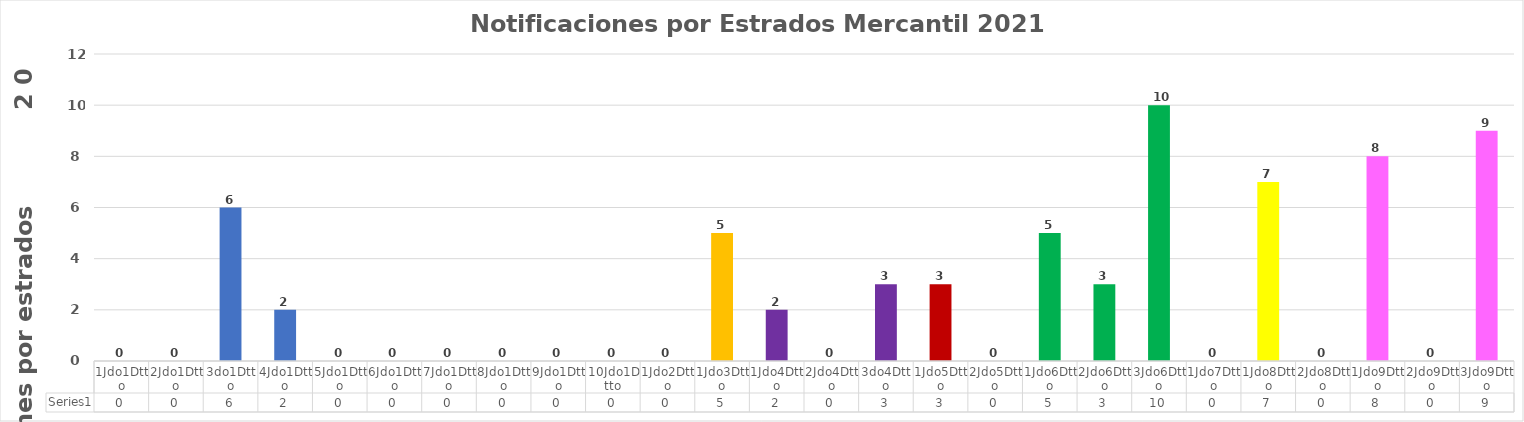
| Category | Series 0 |
|---|---|
| 1Jdo1Dtto | 0 |
| 2Jdo1Dtto | 0 |
| 3do1Dtto | 6 |
| 4Jdo1Dtto | 2 |
| 5Jdo1Dtto | 0 |
| 6Jdo1Dtto | 0 |
| 7Jdo1Dtto | 0 |
| 8Jdo1Dtto | 0 |
| 9Jdo1Dtto | 0 |
| 10Jdo1Dtto | 0 |
| 1Jdo2Dtto | 0 |
| 1Jdo3Dtto | 5 |
| 1Jdo4Dtto | 2 |
| 2Jdo4Dtto | 0 |
| 3do4Dtto | 3 |
| 1Jdo5Dtto | 3 |
| 2Jdo5Dtto | 0 |
| 1Jdo6Dtto | 5 |
| 2Jdo6Dtto | 3 |
| 3Jdo6Dtto | 10 |
| 1Jdo7Dtto | 0 |
| 1Jdo8Dtto | 7 |
| 2Jdo8Dtto | 0 |
| 1Jdo9Dtto | 8 |
| 2Jdo9Dtto | 0 |
| 3Jdo9Dtto | 9 |